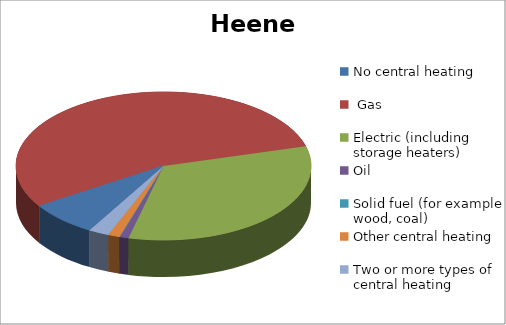
| Category | Heene |
|---|---|
| No central heating | 306 |
|  Gas | 2224 |
| Electric (including storage heaters) | 1343 |
| Oil | 41 |
| Solid fuel (for example wood, coal) | 0 |
| Other central heating | 52 |
| Two or more types of central heating | 91 |